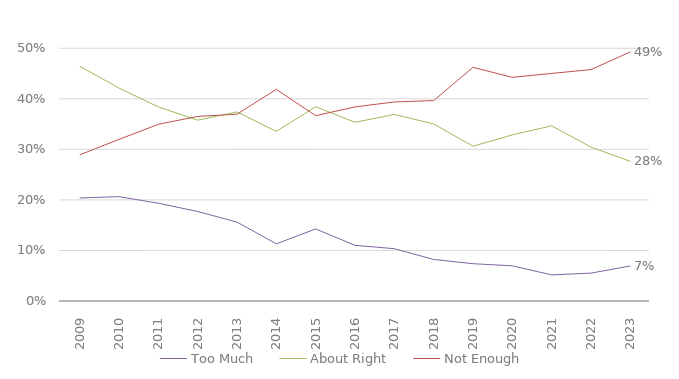
| Category | Too Much | About Right | Not Enough |
|---|---|---|---|
| 2009.0 | 0.204 | 0.465 | 0.289 |
| 2010.0 | 0.206 | 0.421 | 0.32 |
| 2011.0 | 0.194 | 0.384 | 0.35 |
| 2012.0 | 0.177 | 0.358 | 0.365 |
| 2013.0 | 0.156 | 0.374 | 0.369 |
| 2014.0 | 0.113 | 0.335 | 0.419 |
| 2015.0 | 0.143 | 0.384 | 0.367 |
| 2016.0 | 0.11 | 0.354 | 0.384 |
| 2017.0 | 0.104 | 0.369 | 0.394 |
| 2018.0 | 0.082 | 0.35 | 0.397 |
| 2019.0 | 0.074 | 0.306 | 0.462 |
| 2020.0 | 0.07 | 0.329 | 0.443 |
| 2021.0 | 0.052 | 0.346 | 0.45 |
| 2022.0 | 0.055 | 0.305 | 0.458 |
| 2023.0 | 0.069 | 0.276 | 0.493 |